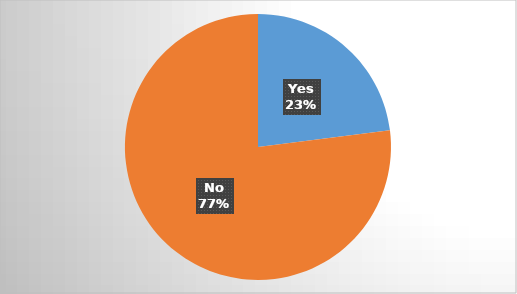
| Category | Lead Actress |
|---|---|
| Yes | 0.23 |
| No | 0.77 |